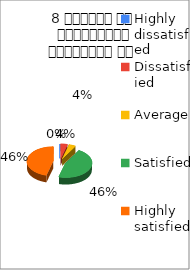
| Category | 8 शिक्षक का सम्प्रेषण सुस्पष्ठ है  |
|---|---|
| Highly dissatisfied | 0 |
| Dissatisfied | 1 |
| Average | 1 |
| Satisfied | 11 |
| Highly satisfied | 11 |